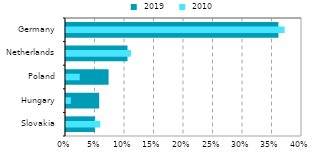
| Category |  2019 |
|---|---|
| Slovakia | 0.049 |
| Hungary | 0.056 |
| Poland | 0.072 |
| Netherlands | 0.104 |
| Germany | 0.36 |